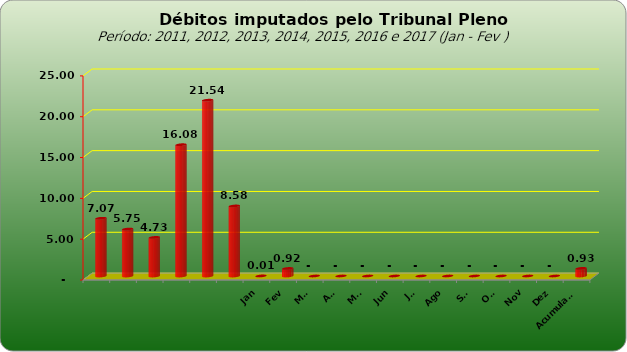
| Category |  7.073.154,74  |
|---|---|
|  | 7073154.74 |
|  | 5749129.25 |
|  | 4727033.51 |
|  | 16081820.48 |
|  | 21535723.6 |
|  | 8578266.09 |
| Jan | 7518 |
| Fev | 924330.96 |
| Mar | 0 |
| Abr | 0 |
| Mai | 0 |
| Jun | 0 |
| Jul | 0 |
| Ago | 0 |
| Set | 0 |
| Out | 0 |
| Nov | 0 |
| Dez | 0 |
| Acumulado | 931848.96 |